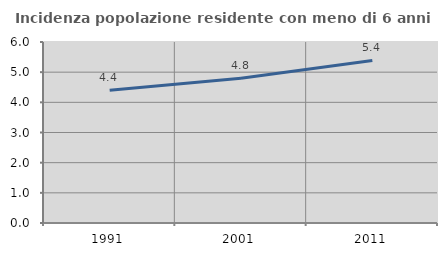
| Category | Incidenza popolazione residente con meno di 6 anni |
|---|---|
| 1991.0 | 4.397 |
| 2001.0 | 4.798 |
| 2011.0 | 5.389 |